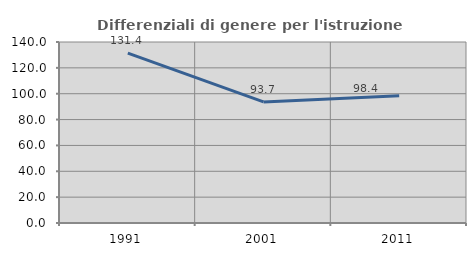
| Category | Differenziali di genere per l'istruzione superiore |
|---|---|
| 1991.0 | 131.429 |
| 2001.0 | 93.675 |
| 2011.0 | 98.433 |